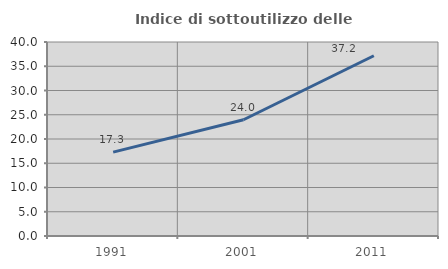
| Category | Indice di sottoutilizzo delle abitazioni  |
|---|---|
| 1991.0 | 17.301 |
| 2001.0 | 23.966 |
| 2011.0 | 37.169 |